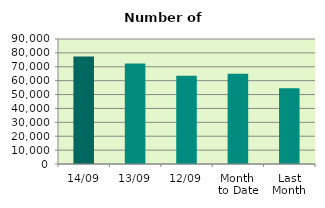
| Category | Series 0 |
|---|---|
| 14/09 | 77318 |
| 13/09 | 72306 |
| 12/09 | 63478 |
| Month 
to Date | 64894.4 |
| Last
Month | 54581.565 |